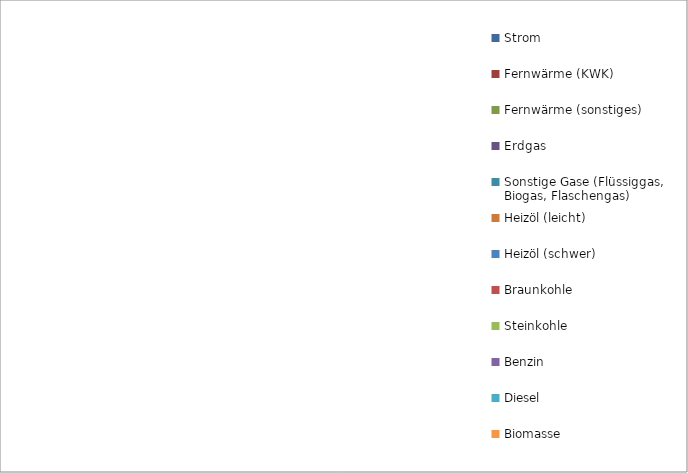
| Category | Series 0 |
|---|---|
| Strom | 0 |
| Fernwärme (KWK) | 0 |
| Fernwärme (sonstiges) | 0 |
| Erdgas | 0 |
| Sonstige Gase (Flüssiggas, Biogas, Flaschengas) | 0 |
| Heizöl (leicht) | 0 |
| Heizöl (schwer) | 0 |
| Braunkohle | 0 |
| Steinkohle | 0 |
| Benzin | 0 |
| Diesel | 0 |
| Biomasse | 0 |